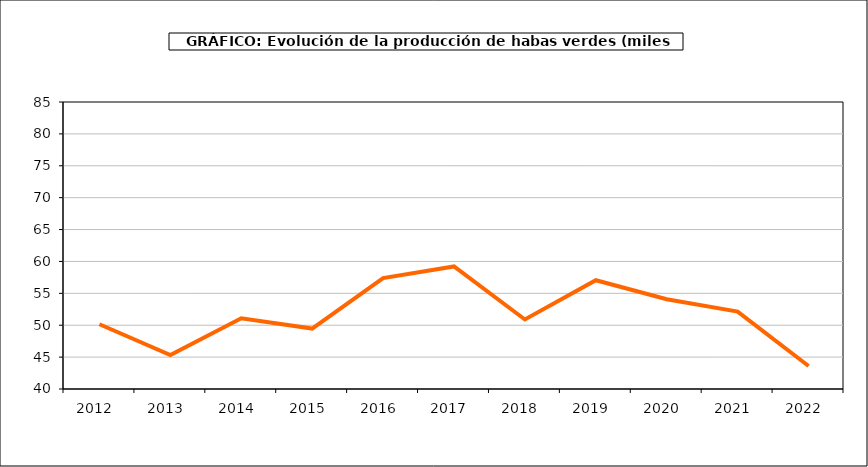
| Category | producción |
|---|---|
| 2012.0 | 50.149 |
| 2013.0 | 45.318 |
| 2014.0 | 51.081 |
| 2015.0 | 49.478 |
| 2016.0 | 57.4 |
| 2017.0 | 59.21 |
| 2018.0 | 50.9 |
| 2019.0 | 57.049 |
| 2020.0 | 54.067 |
| 2021.0 | 52.13 |
| 2022.0 | 43.606 |